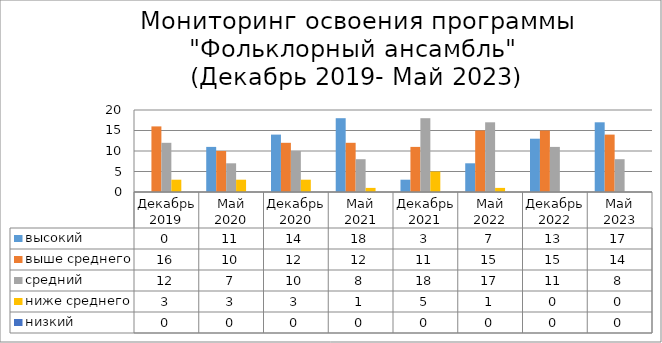
| Category | высокий | выше среднего | средний | ниже среднего | низкий |
|---|---|---|---|---|---|
| Декабрь 2019 | 0 | 16 | 12 | 3 | 0 |
| Май 2020 | 11 | 10 | 7 | 3 | 0 |
| Декабрь 2020 | 14 | 12 | 10 | 3 | 0 |
| Май 2021 | 18 | 12 | 8 | 1 | 0 |
| Декабрь 2021 | 3 | 11 | 18 | 5 | 0 |
| Май 2022 | 7 | 15 | 17 | 1 | 0 |
| Декабрь 2022 | 13 | 15 | 11 | 0 | 0 |
| Май 2023 | 17 | 14 | 8 | 0 | 0 |